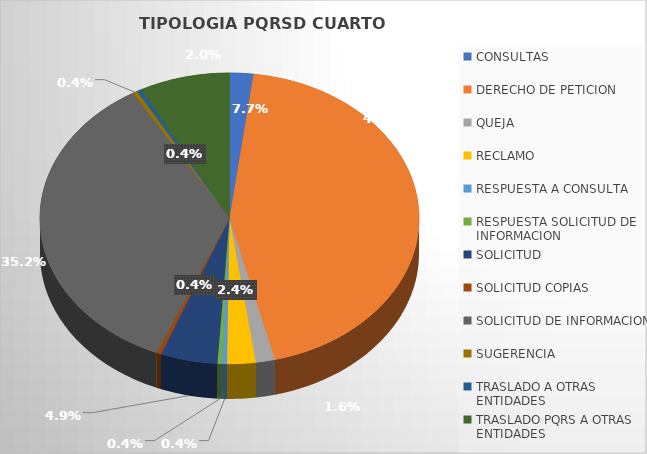
| Category | CANTIDAD |
|---|---|
| CONSULTAS | 5 |
| DERECHO DE PETICION | 109 |
| QUEJA | 4 |
| RECLAMO | 6 |
| RESPUESTA A CONSULTA | 1 |
| RESPUESTA SOLICITUD DE INFORMACION | 1 |
| SOLICITUD | 12 |
| SOLICITUD COPIAS | 1 |
| SOLICITUD DE INFORMACION | 87 |
| SUGERENCIA | 1 |
| TRASLADO A OTRAS ENTIDADES | 1 |
| TRASLADO PQRS A OTRAS ENTIDADES | 19 |